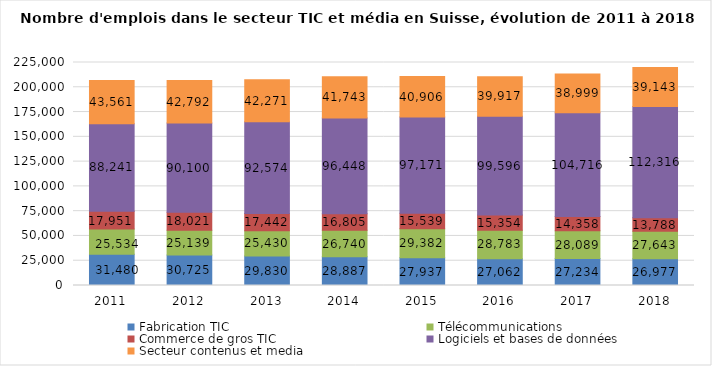
| Category | Fabrication TIC | Télécommunications | Commerce de gros TIC | Logiciels et bases de données | Secteur contenus et media |
|---|---|---|---|---|---|
| 2011.0 | 31480 | 25534 | 17951 | 88241 | 43561 |
| 2012.0 | 30725 | 25139 | 18021 | 90100 | 42792 |
| 2013.0 | 29830 | 25430 | 17442 | 92574 | 42271 |
| 2014.0 | 28887 | 26740 | 16805 | 96448 | 41743 |
| 2015.0 | 27937 | 29382 | 15539 | 97171 | 40906 |
| 2016.0 | 27062 | 28783 | 15354 | 99596 | 39917 |
| 2017.0 | 27234 | 28089 | 14358 | 104716 | 38999 |
| 2018.0 | 26977 | 27643 | 13788 | 112316 | 39143 |